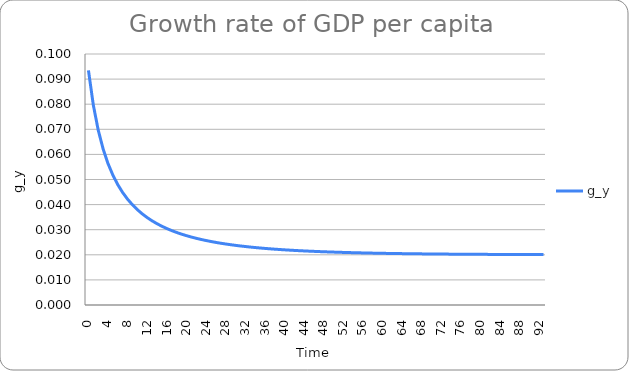
| Category | g_y |
|---|---|
| 0.0 | 0.093 |
| 1.0 | 0.08 |
| 2.0 | 0.07 |
| 3.0 | 0.062 |
| 4.0 | 0.056 |
| 5.0 | 0.052 |
| 6.0 | 0.048 |
| 7.0 | 0.045 |
| 8.0 | 0.042 |
| 9.0 | 0.04 |
| 10.0 | 0.038 |
| 11.0 | 0.036 |
| 12.0 | 0.035 |
| 13.0 | 0.034 |
| 14.0 | 0.032 |
| 15.0 | 0.031 |
| 16.0 | 0.03 |
| 17.0 | 0.03 |
| 18.0 | 0.029 |
| 19.0 | 0.028 |
| 20.0 | 0.028 |
| 21.0 | 0.027 |
| 22.0 | 0.027 |
| 23.0 | 0.026 |
| 24.0 | 0.026 |
| 25.0 | 0.025 |
| 26.0 | 0.025 |
| 27.0 | 0.025 |
| 28.0 | 0.024 |
| 29.0 | 0.024 |
| 30.0 | 0.024 |
| 31.0 | 0.024 |
| 32.0 | 0.023 |
| 33.0 | 0.023 |
| 34.0 | 0.023 |
| 35.0 | 0.023 |
| 36.0 | 0.023 |
| 37.0 | 0.022 |
| 38.0 | 0.022 |
| 39.0 | 0.022 |
| 40.0 | 0.022 |
| 41.0 | 0.022 |
| 42.0 | 0.022 |
| 43.0 | 0.022 |
| 44.0 | 0.022 |
| 45.0 | 0.021 |
| 46.0 | 0.021 |
| 47.0 | 0.021 |
| 48.0 | 0.021 |
| 49.0 | 0.021 |
| 50.0 | 0.021 |
| 51.0 | 0.021 |
| 52.0 | 0.021 |
| 53.0 | 0.021 |
| 54.0 | 0.021 |
| 55.0 | 0.021 |
| 56.0 | 0.021 |
| 57.0 | 0.021 |
| 58.0 | 0.021 |
| 59.0 | 0.021 |
| 60.0 | 0.021 |
| 61.0 | 0.021 |
| 62.0 | 0.021 |
| 63.0 | 0.02 |
| 64.0 | 0.02 |
| 65.0 | 0.02 |
| 66.0 | 0.02 |
| 67.0 | 0.02 |
| 68.0 | 0.02 |
| 69.0 | 0.02 |
| 70.0 | 0.02 |
| 71.0 | 0.02 |
| 72.0 | 0.02 |
| 73.0 | 0.02 |
| 74.0 | 0.02 |
| 75.0 | 0.02 |
| 76.0 | 0.02 |
| 77.0 | 0.02 |
| 78.0 | 0.02 |
| 79.0 | 0.02 |
| 80.0 | 0.02 |
| 81.0 | 0.02 |
| 82.0 | 0.02 |
| 83.0 | 0.02 |
| 84.0 | 0.02 |
| 85.0 | 0.02 |
| 86.0 | 0.02 |
| 87.0 | 0.02 |
| 88.0 | 0.02 |
| 89.0 | 0.02 |
| 90.0 | 0.02 |
| 91.0 | 0.02 |
| 92.0 | 0.02 |
| 93.0 | 0.02 |